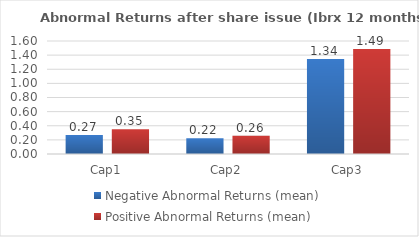
| Category | Negative Abnormal Returns (mean) | Positive Abnormal Returns (mean) |
|---|---|---|
| Cap1 | 0.268 | 0.351 |
| Cap2 | 0.224 | 0.259 |
| Cap3 | 1.345 | 1.488 |